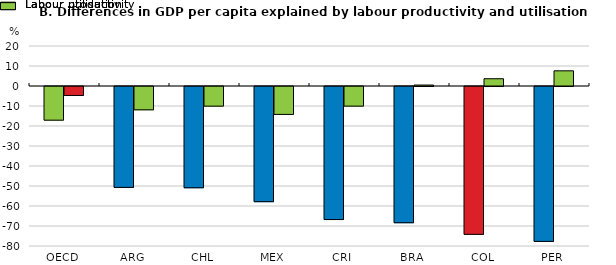
| Category | Labour productivity | Labour utilisation |
|---|---|---|
| OECD | -16.839 | -4.482 |
| ARG | -50.443 | -11.657 |
| CHL | -50.632 | -9.826 |
| MEX | -57.564 | -13.953 |
| CRI | -66.53 | -9.813 |
| BRA | -68.108 | 0.484 |
| COL | -73.922 | 3.637 |
| PER | -77.452 | 7.588 |